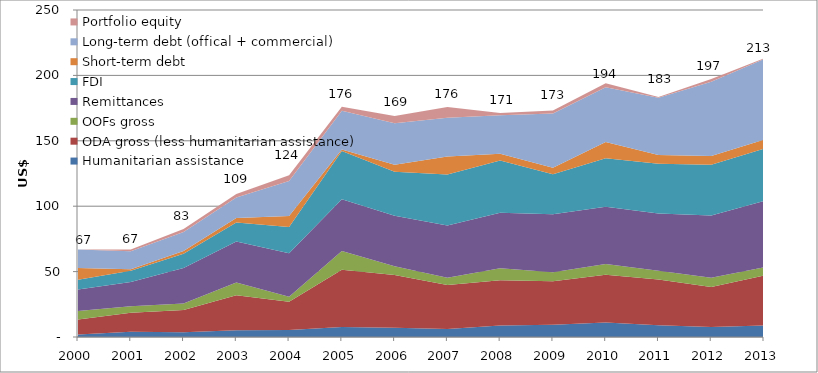
| Category | Humanitarian assistance | ODA gross (less humanitarian assistance) | OOFs gross | Remittances | FDI | Short-term debt | Long-term debt (offical + commercial) | Portfolio equity |
|---|---|---|---|---|---|---|---|---|
| 2000.0 | 1847.985 | 11515.335 | 6448.77 | 16520.076 | 7418.075 | 9030.442 | 14130.931 | 76.976 |
| 2001.0 | 3972.197 | 14573.086 | 4966.33 | 18532.235 | 8588.755 | 1189.277 | 13737.92 | 1273.778 |
| 2002.0 | 3613.435 | 17006.366 | 4932.42 | 27145.025 | 11042.949 | 2017.473 | 14522.457 | 2280.324 |
| 2003.0 | 5108.082 | 26726.23 | 9919.48 | 31299.123 | 14543.153 | 3295.725 | 15805.064 | 2689.619 |
| 2004.0 | 5296.353 | 21569.569 | 3897.55 | 33283.685 | 20139.433 | 8331.926 | 26738.438 | 4462.045 |
| 2005.0 | 7714.298 | 43768.219 | 14239.42 | 39563.075 | 36909.391 | 1197.598 | 29591.488 | 3120.494 |
| 2006.0 | 7018.195 | 40465.288 | 6533.06 | 38682.201 | 33614.302 | 5354.772 | 31696.459 | 5577.55 |
| 2007.0 | 6114.555 | 33729.105 | 5359.6 | 40021.99 | 38985.903 | 13835.989 | 29541.435 | 8293.71 |
| 2008.0 | 8777.144 | 34633.33 | 9205.38 | 42292.069 | 39959.624 | 5142.593 | 29450.879 | 1787.988 |
| 2009.0 | 9360.764 | 33269.825 | 6782.67 | 44374.18 | 30646.483 | 4871.672 | 41652.407 | 2276.543 |
| 2010.0 | 11143.259 | 36373.158 | 8310.9 | 43703.177 | 37139.732 | 12355.827 | 41929.757 | 3079.178 |
| 2011.0 | 8963.305 | 35009.86 | 6633.14 | 43724.889 | 38138.254 | 6655.073 | 43873.928 | 461.348 |
| 2012.0 | 7603.951 | 30663.931 | 7007.45 | 47639.725 | 38703.474 | 6778.064 | 56711.168 | 2163.061 |
| 2013.0 | 8744.11 | 38181.922 | 6381.9 | 50666.613 | 40058.606 | 6754.863 | 61681.867 | 634.404 |